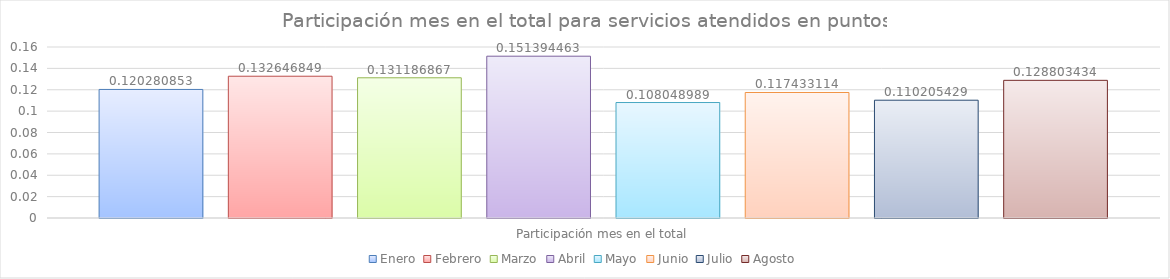
| Category | Enero | Febrero | Marzo | Abril | Mayo | Junio | Julio | Agosto |
|---|---|---|---|---|---|---|---|---|
| Participación mes en el total | 0.12 | 0.133 | 0.131 | 0.151 | 0.108 | 0.117 | 0.11 | 0.129 |